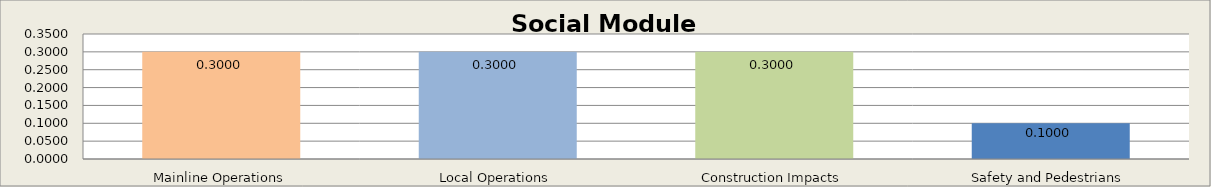
| Category | Social Module |
|---|---|
| Mainline Operations | 0.3 |
| Local Operations | 0.3 |
| Construction Impacts | 0.3 |
| Safety and Pedestrians | 0.1 |